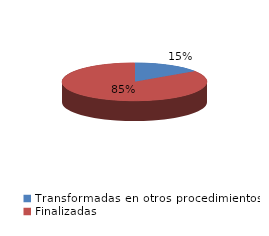
| Category | Series 0 |
|---|---|
| Transformadas en otros procedimientos | 5288 |
| Finalizadas | 29031 |